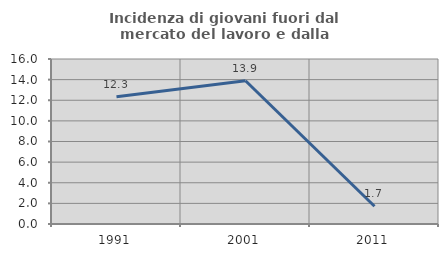
| Category | Incidenza di giovani fuori dal mercato del lavoro e dalla formazione  |
|---|---|
| 1991.0 | 12.329 |
| 2001.0 | 13.889 |
| 2011.0 | 1.724 |